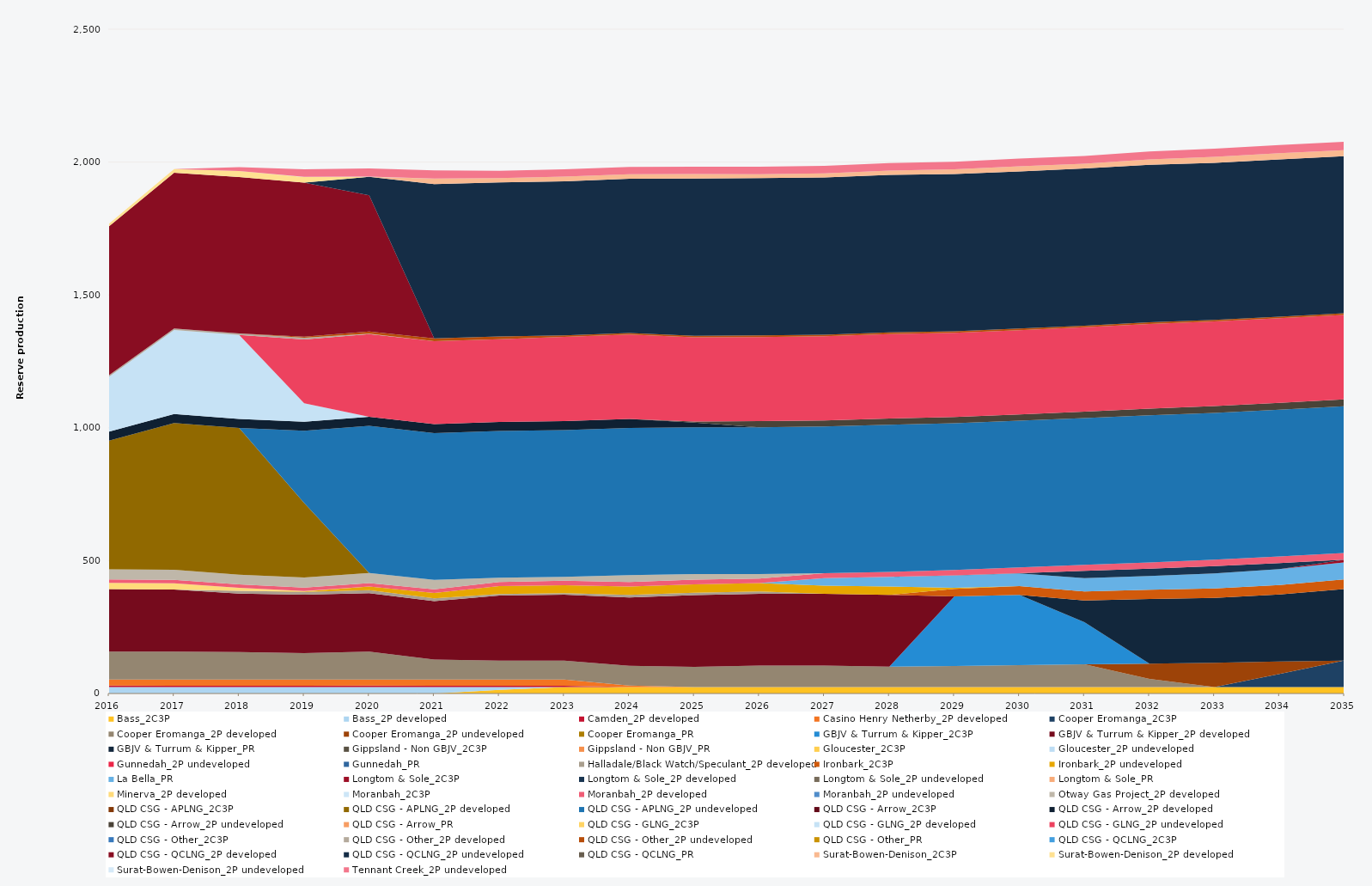
| Category | Bass_2C3P | Bass_2P developed | Camden_2P developed | Casino Henry Netherby_2P developed | Cooper Eromanga_2C3P | Cooper Eromanga_2P developed | Cooper Eromanga_2P undeveloped | Cooper Eromanga_PR | GBJV & Turrum & Kipper_2C3P | GBJV & Turrum & Kipper_2P developed | GBJV & Turrum & Kipper_PR | Gippsland - Non GBJV_2C3P | Gippsland - Non GBJV_PR | Gloucester_2C3P | Gloucester_2P undeveloped | Gunnedah_2P undeveloped | Gunnedah_PR | Halladale/Black Watch/Speculant_2P developed | Ironbark_2C3P | Ironbark_2P undeveloped | La Bella_PR | Longtom & Sole_2C3P | Longtom & Sole_2P developed | Longtom & Sole_2P undeveloped | Longtom & Sole_PR | Minerva_2P developed | Moranbah_2C3P | Moranbah_2P developed | Moranbah_2P undeveloped | Otway Gas Project_2P developed | QLD CSG - APLNG_2C3P | QLD CSG - APLNG_2P developed | QLD CSG - APLNG_2P undeveloped | QLD CSG - Arrow_2C3P | QLD CSG - Arrow_2P developed | QLD CSG - Arrow_2P undeveloped | QLD CSG - Arrow_PR | QLD CSG - GLNG_2C3P | QLD CSG - GLNG_2P developed | QLD CSG - GLNG_2P undeveloped | QLD CSG - Other_2C3P | QLD CSG - Other_2P developed | QLD CSG - Other_2P undeveloped | QLD CSG - Other_PR | QLD CSG - QCLNG_2C3P | QLD CSG - QCLNG_2P developed | QLD CSG - QCLNG_2P undeveloped | QLD CSG - QCLNG_PR | Surat-Bowen-Denison_2C3P | Surat-Bowen-Denison_2P developed | Surat-Bowen-Denison_2P undeveloped | Tennant Creek_2P undeveloped |
|---|---|---|---|---|---|---|---|---|---|---|---|---|---|---|---|---|---|---|---|---|---|---|---|---|---|---|---|---|---|---|---|---|---|---|---|---|---|---|---|---|---|---|---|---|---|---|---|---|---|---|---|---|
| 2016 | 0 | 24.522 | 5 | 23.12 | 0 | 105 | 0 | 0 | 0 | 235.041 | 0 | 0 | 0 | 0 | 0 | 0 | 0 | 0 | 0 | 0 | 0 | 0 | 0 | 0 | 0 | 23.79 | 0 | 12.859 | 0 | 38 | 0 | 484.594 | 0 | 0 | 34.038 | 0 | 0 | 0 | 206.697 | 0 | 0 | 5.856 | 0 | 0 | 0 | 559.876 | 0 | 0 | 0 | 9.617 | 0 | 0 |
| 2017 | 0 | 24.455 | 5 | 23.12 | 0 | 105 | 0 | 0 | 0 | 233.682 | 0 | 0 | 0 | 0 | 0 | 0 | 0 | 0 | 0 | 0 | 0 | 0 | 0 | 0 | 0 | 23.725 | 0 | 12.863 | 0 | 38 | 0 | 552.245 | 0 | 0 | 33.945 | 0 | 0 | 0 | 315.709 | 0 | 0 | 5.84 | 0 | 0 | 0 | 586.595 | 0 | 0 | 0 | 13.467 | 0 | 0 |
| 2018 | 0 | 24.455 | 5 | 23.12 | 0 | 103.781 | 0 | 0 | 0 | 220 | 0 | 0 | 0 | 0 | 0 | 0 | 0 | 10.254 | 0 | 0 | 0 | 0 | 0 | 0 | 0 | 11.236 | 0 | 13.029 | 0 | 36.497 | 0 | 552.245 | 0 | 0 | 33.945 | 0 | 0 | 0 | 315.639 | 0 | 0 | 5.84 | 0 | 0 | 0 | 588.867 | 0 | 0 | 0 | 22.79 | 0 | 14.512 |
| 2019 | 0 | 24.455 | 5 | 23.12 | 0 | 99.088 | 0 | 0 | 0 | 220 | 0 | 0 | 0 | 0 | 0 | 0 | 0 | 10.95 | 0 | 1.088 | 0 | 0 | 0 | 0 | 0 | 1.999 | 0 | 12.796 | 0 | 38 | 0 | 280.466 | 271.779 | 0 | 33.945 | 0 | 0 | 0 | 69.255 | 240.872 | 0 | 5.84 | 4.563 | 0 | 0 | 579.711 | 0 | 0 | 0 | 20.942 | 0.957 | 28.083 |
| 2020 | 0 | 24.522 | 5 | 23.12 | 0 | 105 | 0 | 0 | 0 | 220 | 0 | 0 | 0 | 0 | 0 | 0 | 0 | 10.95 | 0 | 14.318 | 0 | 0 | 0 | 0 | 0 | 0 | 0 | 12.768 | 0 | 37.92 | 0 | 0 | 553.758 | 0 | 34.038 | 0 | 0 | 0 | 0 | 310.96 | 0 | 1.624 | 8.795 | 0 | 0 | 512.351 | 69.09 | 0 | 0 | 0 | 1.043 | 30.881 |
| 2021 | 0 | 24.455 | 5 | 23.12 | 0 | 75.033 | 0 | 0 | 0 | 220 | 0 | 0 | 0 | 0 | 0 | 0 | 0 | 10.95 | 0 | 19.943 | 0 | 0 | 0 | 0 | 0 | 0 | 0 | 13.526 | 0 | 35.929 | 0 | 0 | 552.245 | 0 | 33.945 | 0 | 0 | 0 | 0 | 311.967 | 0 | 0 | 10.403 | 0 | 0 | 0 | 580.143 | 0 | 21.758 | 0 | 0 | 30.387 |
| 2022 | 13.672 | 10.783 | 5 | 23.12 | 0 | 71.044 | 0 | 0 | 0 | 245.44 | 0 | 0 | 0 | 0 | 0 | 0 | 0 | 5.059 | 0 | 30.17 | 0 | 0 | 0 | 0 | 0 | 0 | 0 | 15.305 | 0 | 15.814 | 0 | 0 | 552.245 | 0 | 33.945 | 0 | 0 | 0 | 0 | 311.905 | 0 | 0 | 10.403 | 0 | 0 | 0 | 579.646 | 0 | 16.345 | 0 | 0 | 27.517 |
| 2023 | 24.455 | 0 | 5 | 23.12 | 0 | 71.359 | 0 | 0 | 0 | 248.107 | 0 | 0 | 0 | 0 | 0 | 0 | 0 | 5.6 | 0 | 30.17 | 0 | 0 | 0 | 0 | 0 | 0 | 0 | 16.282 | 0 | 14.937 | 0 | 0 | 552.245 | 0 | 33.945 | 0 | 0 | 0 | 0 | 316.633 | 0 | 0 | 5.84 | 0 | 0 | 0 | 579.627 | 0 | 17.951 | 0 | 0 | 27.672 |
| 2024 | 24.522 | 0 | 0 | 5.3 | 0 | 74.572 | 0 | 0 | 0 | 256.838 | 0 | 0 | 0 | 0 | 0 | 0 | 0 | 10.141 | 0 | 31.066 | 0 | 0 | 0 | 0 | 0 | 0 | 0 | 16.806 | 0 | 26.42 | 0 | 0 | 553.758 | 0 | 34.038 | 0 | 0 | 0 | 0 | 317.367 | 0 | 0 | 5.856 | 0 | 0 | 0 | 580.633 | 0 | 17.159 | 0 | 0 | 27.367 |
| 2025 | 24.455 | 0 | 0 | 0 | 0 | 76.162 | 0 | 0 | 0 | 270 | 0 | 0 | 0 | 0 | 0 | 0 | 0 | 8.829 | 0 | 31.407 | 0 | 0 | 0 | 0 | 0 | 0 | 0 | 17.285 | 0 | 21.191 | 0 | 0 | 552.245 | 0 | 18.166 | 3.911 | 0 | 0 | 0 | 316.806 | 0 | 0 | 5.84 | 0 | 0 | 0 | 591.794 | 0 | 17.19 | 0 | 0 | 27.579 |
| 2026 | 24.455 | 0 | 0 | 0 | 0 | 80.499 | 0 | 0 | 0 | 270 | 0 | 0 | 0 | 0 | 0 | 0 | 0 | 9.267 | 0 | 31.209 | 0 | 0 | 0 | 0 | 0 | 0 | 0 | 17.534 | 0 | 16.9 | 0 | 0 | 552.245 | 0 | 0 | 22.876 | 0 | 0 | 0 | 316.704 | 0 | 0 | 5.84 | 0 | 0 | 0 | 591.753 | 0 | 15.255 | 0 | 0 | 27.77 |
| 2027 | 24.455 | 0 | 0 | 0 | 0 | 80.561 | 0 | 0 | 0 | 270 | 0 | 0 | 0 | 0 | 0 | 0 | 0 | 0 | 0 | 31.251 | 28 | 0 | 0 | 0 | 0 | 0 | 0 | 18.159 | 0 | 0 | 0 | 0 | 552.245 | 0 | 0 | 23.167 | 0 | 0 | 0 | 316.867 | 0 | 0 | 5.84 | 0 | 0 | 0 | 591.694 | 0 | 15.617 | 0 | 0 | 27.987 |
| 2028 | 24.522 | 0 | 0 | 0 | 0 | 76.561 | 0 | 0 | 0 | 270 | 0 | 0 | 0 | 0 | 0 | 0 | 0 | 0 | 0 | 31.585 | 36.25 | 0 | 0 | 0 | 0 | 0 | 0 | 19.008 | 0 | 0 | 0 | 0 | 553.758 | 0 | 0 | 23.513 | 0 | 0 | 0 | 317.838 | 0 | 0 | 5.856 | 0 | 0 | 0 | 593.235 | 0 | 15.87 | 0 | 0 | 28.197 |
| 2029 | 24.455 | 0 | 0 | 0 | 0 | 79.357 | 0 | 0 | 262.044 | 0 | 0 | 0 | 0 | 0 | 0 | 0 | 0 | 0 | 28.097 | 3.792 | 46.008 | 0 | 0.638 | 0 | 0 | 0 | 0 | 20.36 | 0 | 0 | 0 | 0 | 552.245 | 0 | 0 | 23.397 | 0 | 0 | 0 | 316.91 | 0 | 0 | 5.84 | 0 | 0 | 0 | 591.622 | 0 | 18.098 | 0 | 0 | 28.519 |
| 2030 | 24.455 | 0 | 0 | 0 | 0 | 82.324 | 0 | 0 | 264.56 | 0 | 0 | 0 | 0 | 0 | 0 | 0 | 0 | 0 | 33.138 | 0 | 47.511 | 0 | 0.73 | 0 | 0 | 0 | 0 | 21.622 | 0 | 0 | 0 | 0 | 552.245 | 0 | 0 | 23.644 | 0 | 0 | 0 | 317.293 | 0 | 0 | 5.84 | 0 | 0 | 0 | 591.579 | 0 | 19.011 | 0 | 0 | 28.91 |
| 2031 | 24.455 | 0 | 0 | 0 | 0 | 85.103 | 0 | 0 | 159.11 | 0 | 81.102 | 0 | 0 | 0 | 0 | 0 | 0 | 0 | 34.272 | 0 | 50.487 | 0 | 27.375 | 0 | 0 | 0 | 0 | 22.567 | 0 | 0 | 0 | 0 | 552.245 | 0 | 0 | 24.211 | 0 | 0 | 0 | 317.568 | 0 | 0 | 5.84 | 0 | 0 | 0 | 591.53 | 0 | 17.968 | 0 | 0 | 29.222 |
| 2032 | 24.522 | 0 | 0 | 0 | 0 | 30.554 | 57.402 | 0 | 0 | 0 | 242.999 | 0 | 0 | 0 | 0 | 0 | 0 | 0 | 35.168 | 0 | 51.71 | 0 | 27.45 | 0 | 0 | 0 | 0 | 23.484 | 0 | 0 | 0 | 0 | 553.758 | 0 | 0 | 25.31 | 0 | 0 | 0 | 318.7 | 0 | 0 | 5.856 | 0 | 0 | 0 | 593.07 | 0 | 19.93 | 0 | 0 | 30.12 |
| 2033 | 24.455 | 0 | 0 | 0 | 0 | 0 | 90.925 | 0 | 0 | 0 | 244.508 | 0 | 0 | 0 | 0 | 0 | 0 | 0 | 35.704 | 0 | 56.377 | 0 | 27.375 | 0 | 0 | 0 | 0 | 23.992 | 0 | 0 | 0 | 0 | 552.245 | 0 | 0 | 26.325 | 0 | 0 | 0 | 318.169 | 0 | 0 | 5.84 | 0 | 0 | 0 | 591.435 | 0 | 22.42 | 0 | 0 | 30.603 |
| 2034 | 24.455 | 0 | 0 | 0 | 49.37 | 0 | 46.255 | 0 | 0 | 0 | 252.337 | 0 | 0 | 0 | 0 | 0 | 0 | 0 | 35.88 | 0 | 59.766 | 0 | 22.915 | 0 | 0 | 0 | 0 | 24.563 | 0 | 0 | 0 | 0 | 552.245 | 0 | 0 | 26.511 | 0 | 0 | 0 | 318.356 | 0 | 0 | 5.84 | 0 | 0 | 0 | 591.394 | 0 | 23.195 | 0 | 0 | 30.906 |
| 2035 | 24.455 | 0 | 0 | 0 | 99.532 | 0 | 0 | 0 | 0 | 0 | 269.427 | 0 | 0 | 0 | 0 | 0 | 0 | 0 | 35.992 | 0 | 64.316 | 10.029 | 0 | 0 | 0 | 0 | 0 | 24.813 | 0 | 0 | 0 | 0 | 552.245 | 0 | 0 | 26.426 | 0 | 0 | 0 | 317.84 | 0 | 0 | 5.84 | 0 | 0 | 0 | 591.053 | 0 | 22.933 | 0 | 0 | 31.375 |